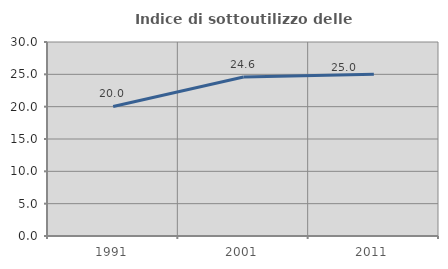
| Category | Indice di sottoutilizzo delle abitazioni  |
|---|---|
| 1991.0 | 20.029 |
| 2001.0 | 24.583 |
| 2011.0 | 25.016 |